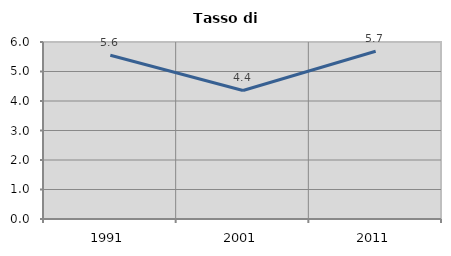
| Category | Tasso di disoccupazione   |
|---|---|
| 1991.0 | 5.552 |
| 2001.0 | 4.358 |
| 2011.0 | 5.686 |